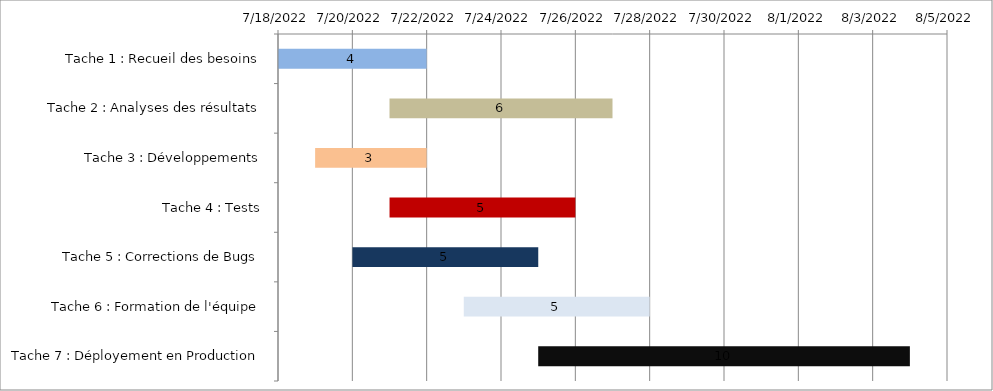
| Category | Début | Duréée |
|---|---|---|
| Tache 1 : Recueil des besoins | 7/18/22 | 4 |
| Tache 2 : Analyses des résultats | 7/21/22 | 6 |
| Tache 3 : Développements | 7/19/22 | 3 |
| Tache 4 : Tests | 7/21/22 | 5 |
| Tache 5 : Corrections de Bugs | 7/20/22 | 5 |
| Tache 6 : Formation de l'équipe | 7/23/22 | 5 |
| Tache 7 : Déployement en Production | 7/25/22 | 10 |